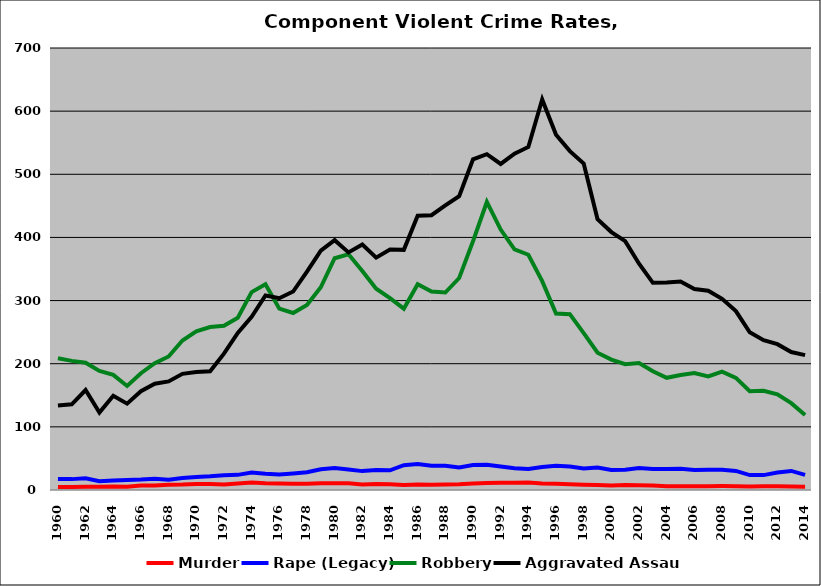
| Category | Murder | Rape (Legacy) | Robbery | Aggravated Assault |
|---|---|---|---|---|
| 1960.0 | 4.851 | 17.587 | 208.786 | 133.834 |
| 1961.0 | 4.796 | 17.226 | 204.494 | 135.699 |
| 1962.0 | 5.293 | 18.569 | 201.478 | 158.319 |
| 1963.0 | 5.137 | 13.907 | 188.499 | 122.717 |
| 1964.0 | 5.453 | 14.959 | 182.315 | 149.223 |
| 1965.0 | 5.177 | 16.028 | 164.741 | 136.725 |
| 1966.0 | 6.948 | 16.573 | 184.891 | 156.407 |
| 1967.0 | 7.28 | 17.929 | 200.854 | 168.282 |
| 1968.0 | 8.137 | 16.384 | 211.491 | 172.007 |
| 1969.0 | 8.6 | 19.127 | 236.743 | 184.005 |
| 1970.0 | 9.592 | 20.425 | 251.107 | 186.81 |
| 1971.0 | 9.637 | 21.597 | 258.128 | 187.915 |
| 1972.0 | 8.755 | 23.313 | 260.128 | 215.865 |
| 1973.0 | 10.351 | 23.977 | 272.793 | 248.745 |
| 1974.0 | 11.85 | 27.688 | 313.377 | 274.216 |
| 1975.0 | 10.579 | 25.742 | 325.778 | 308.147 |
| 1976.0 | 10.339 | 24.606 | 287.14 | 303.669 |
| 1977.0 | 9.862 | 26.074 | 280.338 | 314.317 |
| 1978.0 | 9.855 | 28.026 | 292.911 | 345.931 |
| 1979.0 | 10.712 | 32.965 | 321.069 | 379.154 |
| 1980.0 | 10.612 | 34.786 | 367.017 | 395.621 |
| 1981.0 | 10.519 | 32.44 | 373.217 | 376.325 |
| 1982.0 | 8.779 | 29.909 | 346.785 | 388.845 |
| 1983.0 | 9.681 | 31.508 | 318.866 | 368.039 |
| 1984.0 | 8.974 | 31.222 | 303.753 | 380.931 |
| 1985.0 | 8.036 | 39.263 | 287.126 | 380.338 |
| 1986.0 | 8.87 | 41.316 | 325.874 | 434.258 |
| 1987.0 | 8.349 | 38.361 | 314.333 | 435.158 |
| 1988.0 | 8.585 | 38.54 | 312.691 | 450.624 |
| 1989.0 | 9.015 | 35.692 | 335.718 | 465.44 |
| 1990.0 | 10.341 | 39.412 | 394.012 | 523.594 |
| 1991.0 | 11.262 | 39.981 | 456.147 | 531.811 |
| 1992.0 | 11.366 | 37.073 | 412.458 | 516.353 |
| 1993.0 | 11.388 | 34.59 | 381.158 | 532.598 |
| 1994.0 | 11.726 | 33.296 | 372.6 | 543.303 |
| 1995.0 | 10.321 | 36.458 | 330.845 | 618.453 |
| 1996.0 | 9.952 | 38.389 | 279.446 | 562.581 |
| 1997.0 | 9.213 | 37.113 | 278.438 | 536.668 |
| 1998.0 | 8.369 | 33.998 | 248.46 | 516.903 |
| 1999.0 | 7.742 | 35.429 | 217.383 | 428.912 |
| 2000.0 | 7.231 | 31.612 | 206.461 | 408.485 |
| 2001.0 | 7.843 | 32.028 | 199.126 | 394.138 |
| 2002.0 | 7.635 | 34.72 | 201.121 | 358.433 |
| 2003.0 | 7.076 | 33.117 | 188.045 | 328.134 |
| 2004.0 | 6.136 | 33.197 | 177.643 | 328.689 |
| 2005.0 | 6.032 | 33.787 | 182.172 | 330.251 |
| 2006.0 | 6.079 | 31.78 | 185.334 | 318.408 |
| 2007.0 | 5.851 | 31.924 | 179.731 | 315.681 |
| 2008.0 | 6.151 | 31.955 | 187.395 | 302.726 |
| 2009.0 | 5.987 | 30.216 | 177.554 | 283.399 |
| 2010.0 | 5.502 | 23.639 | 156.298 | 249.73 |
| 2011.0 | 6.073 | 23.562 | 157.211 | 237.135 |
| 2012.0 | 5.984 | 27.828 | 151.381 | 230.996 |
| 2013.0 | 5.601 | 30.216 | 137.566 | 218.462 |
| 2014.0 | 5.318 | 23.92 | 118.776 | 213.655 |